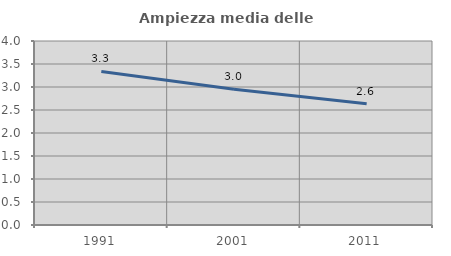
| Category | Ampiezza media delle famiglie |
|---|---|
| 1991.0 | 3.337 |
| 2001.0 | 2.953 |
| 2011.0 | 2.634 |